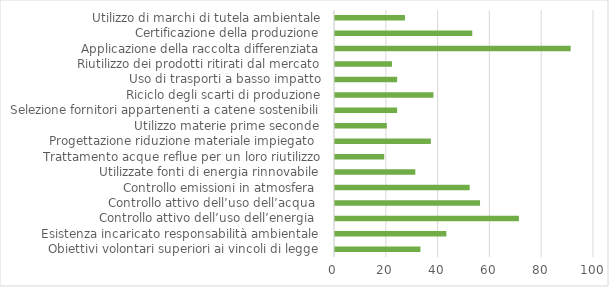
| Category | Series 5 |
|---|---|
| Obiettivi volontari superiori ai vincoli di legge | 33 |
| Esistenza incaricato responsabilità ambientale | 43 |
| Controllo attivo dell’uso dell’energia  | 71 |
| Controllo attivo dell’uso dell’acqua  | 56 |
| Controllo emissioni in atmosfera  | 52 |
| Utilizzate fonti di energia rinnovabile | 31 |
| Trattamento acque reflue per un loro riutilizzo | 19 |
| Progettazione riduzione materiale impiegato  | 37 |
| Utilizzo materie prime seconde | 20 |
| Selezione fornitori appartenenti a catene sostenibili | 24 |
| Riciclo degli scarti di produzione | 38 |
| Uso di trasporti a basso impatto | 24 |
| Riutilizzo dei prodotti ritirati dal mercato | 22 |
| Applicazione della raccolta differenziata | 91 |
| Certificazione della produzione | 53 |
| Utilizzo di marchi di tutela ambientale | 27 |